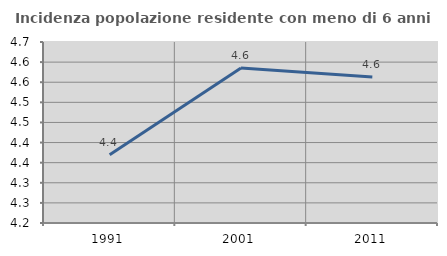
| Category | Incidenza popolazione residente con meno di 6 anni |
|---|---|
| 1991.0 | 4.369 |
| 2001.0 | 4.585 |
| 2011.0 | 4.563 |